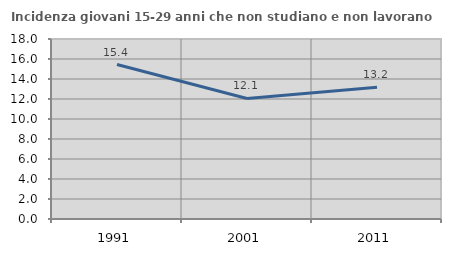
| Category | Incidenza giovani 15-29 anni che non studiano e non lavorano  |
|---|---|
| 1991.0 | 15.444 |
| 2001.0 | 12.051 |
| 2011.0 | 13.165 |